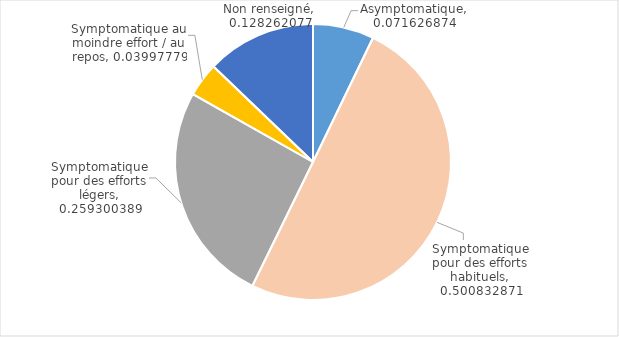
| Category | Series 0 |
|---|---|
| Asymptomatique | 0.072 |
| Symptomatique pour des efforts habituels | 0.501 |
| Symptomatique pour des efforts légers | 0.259 |
| Symptomatique au moindre effort / au repos | 0.04 |
| Non renseigné | 0.128 |